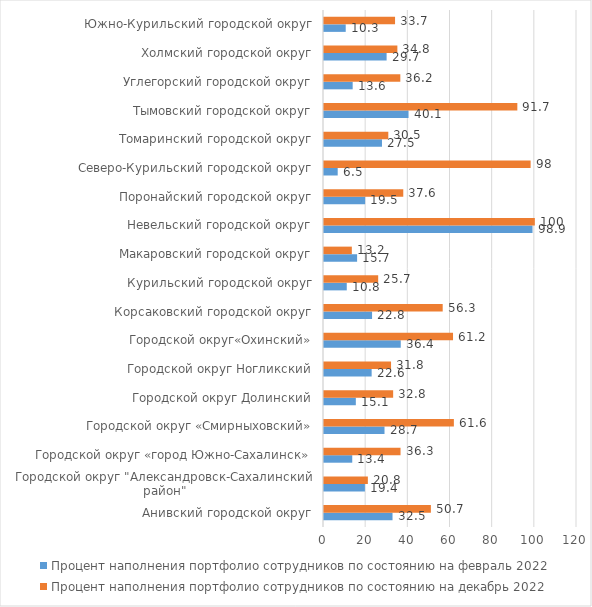
| Category | Процент наполнения портфолио сотрудников по состоянию на февраль 2022 | Процент наполнения портфолио сотрудников по состоянию на декабрь 2022 |
|---|---|---|
| Анивский городской округ | 32.5 | 50.7 |
| Городской округ "Александровск-Сахалинский район" | 19.4 | 20.8 |
| Городской округ «город Южно-Сахалинск» | 13.4 | 36.3 |
| Городской округ «Смирныховский» | 28.7 | 61.6 |
| Городской округ Долинский | 15.1 | 32.8 |
| Городской округ Ногликский | 22.6 | 31.8 |
| Городской округ«Охинский» | 36.4 | 61.2 |
| Корсаковский городской округ | 22.8 | 56.3 |
| Курильский городской округ | 10.8 | 25.7 |
| Макаровский городской округ | 15.7 | 13.2 |
| Невельский городской округ | 98.9 | 100 |
| Поронайский городской округ | 19.5 | 37.6 |
| Северо-Курильский городской округ | 6.5 | 98 |
| Томаринский городской округ | 27.5 | 30.5 |
| Тымовский городской округ | 40.1 | 91.7 |
| Углегорский городской округ | 13.6 | 36.2 |
| Холмский городской округ | 29.7 | 34.8 |
| Южно-Курильский городской округ | 10.3 | 33.7 |